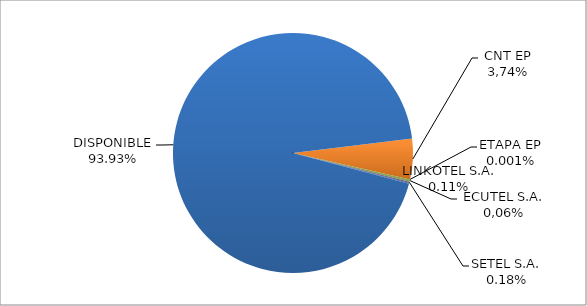
| Category | CODIGO DE AREA 6 |
|---|---|
| CORPORACIÓN NACIONAL TELECOMUNICACIONES CNT EP | 0.055 |
| ETAPA EP | 0 |
| CONECEL (ex ECUADORTELECOM S.A.) | 0.003 |
| SETEL S.A. | 0.002 |
| LINKOTEL S.A. | 0.001 |
| DISPONIBLE | 0.939 |